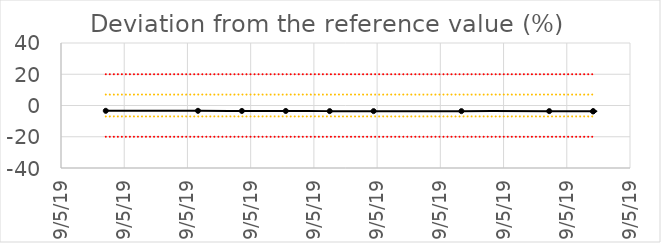
| Category | Abweichung Sollwert |
|---|---|
| 43594.37708333333 | -3.4 |
| 43594.39166666667 | -3.4 |
| 43594.39861111111 | -3.5 |
| 43594.40555555555 | -3.5 |
| 43594.4125 | -3.6 |
| 43594.419444444444 | -3.6 |
| 43594.433333333334 | -3.6 |
| 43594.447222222225 | -3.6 |
| 43594.45416666667 | -3.7 |
| 43594.45416666667 | -3.7 |
| nan | 0 |
| nan | 0 |
| nan | 0 |
| nan | 0 |
| nan | 0 |
| nan | 0 |
| nan | 0 |
| nan | 0 |
| nan | 0 |
| nan | 0 |
| nan | 0 |
| nan | 0 |
| nan | 0 |
| nan | 0 |
| nan | 0 |
| nan | 0 |
| nan | 0 |
| nan | 0 |
| nan | 0 |
| nan | 0 |
| nan | 0 |
| nan | 0 |
| nan | 0 |
| nan | 0 |
| nan | 0 |
| nan | 0 |
| nan | 0 |
| nan | 0 |
| nan | 0 |
| nan | 0 |
| nan | 0 |
| nan | 0 |
| nan | 0 |
| nan | 0 |
| nan | 0 |
| nan | 0 |
| nan | 0 |
| nan | 0 |
| nan | 0 |
| nan | 0 |
| nan | 0 |
| nan | 0 |
| nan | 0 |
| nan | 0 |
| nan | 0 |
| nan | 0 |
| nan | 0 |
| nan | 0 |
| nan | 0 |
| nan | 0 |
| nan | 0 |
| nan | 0 |
| nan | 0 |
| nan | 0 |
| nan | 0 |
| nan | 0 |
| nan | 0 |
| nan | 0 |
| nan | 0 |
| nan | 0 |
| nan | 0 |
| nan | 0 |
| nan | 0 |
| nan | 0 |
| nan | 0 |
| nan | 0 |
| nan | 0 |
| nan | 0 |
| nan | 0 |
| nan | 0 |
| nan | 0 |
| nan | 0 |
| nan | 0 |
| nan | 0 |
| nan | 0 |
| nan | 0 |
| nan | 0 |
| nan | 0 |
| nan | 0 |
| nan | 0 |
| nan | 0 |
| nan | 0 |
| nan | 0 |
| nan | 0 |
| nan | 0 |
| nan | 0 |
| nan | 0 |
| nan | 0 |
| nan | 0 |
| nan | 0 |